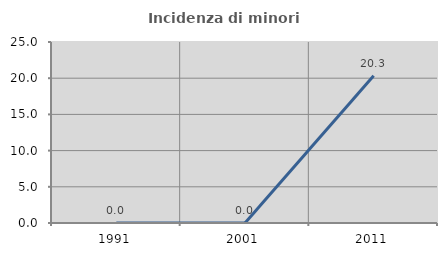
| Category | Incidenza di minori stranieri |
|---|---|
| 1991.0 | 0 |
| 2001.0 | 0 |
| 2011.0 | 20.339 |